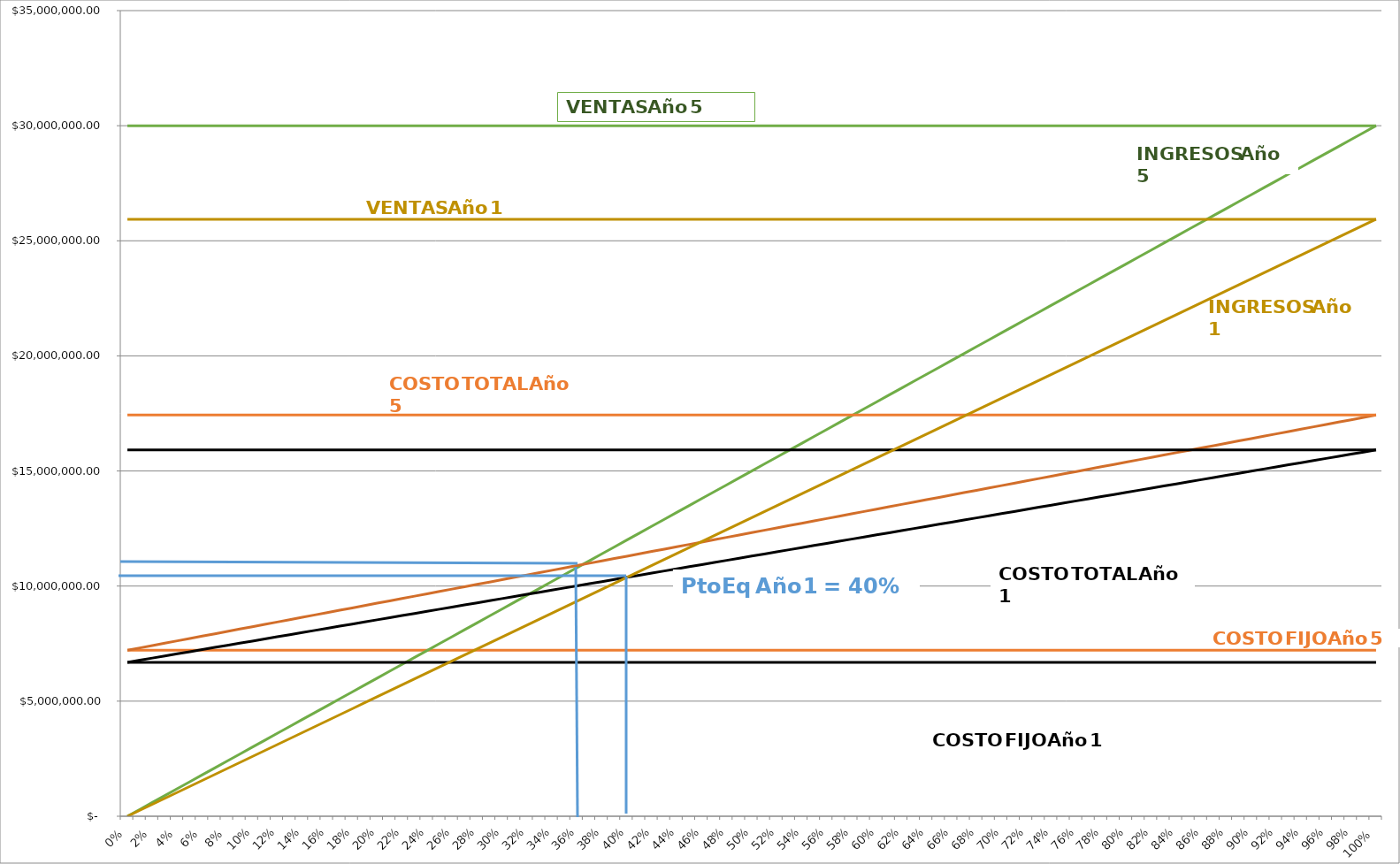
| Category | Ventas Año 5 | CFT Año 5 | Ing Año 5 | CV Año 5 | CT Año 5 | Ventas Año 1 | CFT Año 1 | CV Año 1 | CT Año 1 | Ing Año 1 |
|---|---|---|---|---|---|---|---|---|---|---|
| 0.0 | 30000000 | 7212171.791 | 0 | 7212171.791 | 17429390.383 | 25937500 | 6688326.688 | 6688326.688 | 15915076.216 | 0 |
| 0.01 | 30000000 | 7212171.791 | 300000 | 7314343.977 | 17429390.383 | 25937500 | 6688326.688 | 6780594.184 | 15915076.216 | 259375 |
| 0.02 | 30000000 | 7212171.791 | 600000 | 7416516.163 | 17429390.383 | 25937500 | 6688326.688 | 6872861.679 | 15915076.216 | 518750 |
| 0.03 | 30000000 | 7212171.791 | 900000 | 7518688.349 | 17429390.383 | 25937500 | 6688326.688 | 6965129.174 | 15915076.216 | 778125 |
| 0.04 | 30000000 | 7212171.791 | 1200000 | 7620860.535 | 17429390.383 | 25937500 | 6688326.688 | 7057396.669 | 15915076.216 | 1037500 |
| 0.05 | 30000000 | 7212171.791 | 1500000 | 7723032.721 | 17429390.383 | 25937500 | 6688326.688 | 7149664.165 | 15915076.216 | 1296875 |
| 0.06 | 30000000 | 7212171.791 | 1800000 | 7825204.907 | 17429390.383 | 25937500 | 6688326.688 | 7241931.66 | 15915076.216 | 1556250 |
| 0.07 | 30000000 | 7212171.791 | 2100000 | 7927377.093 | 17429390.383 | 25937500 | 6688326.688 | 7334199.155 | 15915076.216 | 1815625 |
| 0.08 | 30000000 | 7212171.791 | 2400000 | 8029549.279 | 17429390.383 | 25937500 | 6688326.688 | 7426466.651 | 15915076.216 | 2075000 |
| 0.09 | 30000000 | 7212171.791 | 2700000 | 8131721.465 | 17429390.383 | 25937500 | 6688326.688 | 7518734.146 | 15915076.216 | 2334375 |
| 0.1 | 30000000 | 7212171.791 | 3000000 | 8233893.651 | 17429390.383 | 25937500 | 6688326.688 | 7611001.641 | 15915076.216 | 2593750 |
| 0.11 | 30000000 | 7212171.791 | 3300000 | 8336065.836 | 17429390.383 | 25937500 | 6688326.688 | 7703269.136 | 15915076.216 | 2853125 |
| 0.12 | 30000000 | 7212171.791 | 3600000 | 8438238.022 | 17429390.383 | 25937500 | 6688326.688 | 7795536.632 | 15915076.216 | 3112500 |
| 0.13 | 30000000 | 7212171.791 | 3900000 | 8540410.208 | 17429390.383 | 25937500 | 6688326.688 | 7887804.127 | 15915076.216 | 3371875 |
| 0.14 | 30000000 | 7212171.791 | 4200000 | 8642582.394 | 17429390.383 | 25937500 | 6688326.688 | 7980071.622 | 15915076.216 | 3631250 |
| 0.15 | 30000000 | 7212171.791 | 4500000 | 8744754.58 | 17429390.383 | 25937500 | 6688326.688 | 8072339.117 | 15915076.216 | 3890625 |
| 0.16 | 30000000 | 7212171.791 | 4800000 | 8846926.766 | 17429390.383 | 25937500 | 6688326.688 | 8164606.613 | 15915076.216 | 4150000 |
| 0.17 | 30000000 | 7212171.791 | 5100000 | 8949098.952 | 17429390.383 | 25937500 | 6688326.688 | 8256874.108 | 15915076.216 | 4409375 |
| 0.18 | 30000000 | 7212171.791 | 5400000 | 9051271.138 | 17429390.383 | 25937500 | 6688326.688 | 8349141.603 | 15915076.216 | 4668750 |
| 0.19 | 30000000 | 7212171.791 | 5700000 | 9153443.324 | 17429390.383 | 25937500 | 6688326.688 | 8441409.099 | 15915076.216 | 4928125 |
| 0.2 | 30000000 | 7212171.791 | 6000000 | 9255615.51 | 17429390.383 | 25937500 | 6688326.688 | 8533676.594 | 15915076.216 | 5187500 |
| 0.21 | 30000000 | 7212171.791 | 6300000 | 9357787.696 | 17429390.383 | 25937500 | 6688326.688 | 8625944.089 | 15915076.216 | 5446875 |
| 0.22 | 30000000 | 7212171.791 | 6600000 | 9459959.882 | 17429390.383 | 25937500 | 6688326.688 | 8718211.584 | 15915076.216 | 5706250 |
| 0.23 | 30000000 | 7212171.791 | 6900000 | 9562132.068 | 17429390.383 | 25937500 | 6688326.688 | 8810479.08 | 15915076.216 | 5965625 |
| 0.24 | 30000000 | 7212171.791 | 7200000 | 9664304.253 | 17429390.383 | 25937500 | 6688326.688 | 8902746.575 | 15915076.216 | 6225000 |
| 0.25 | 30000000 | 7212171.791 | 7500000 | 9766476.439 | 17429390.383 | 25937500 | 6688326.688 | 8995014.07 | 15915076.216 | 6484375 |
| 0.26 | 30000000 | 7212171.791 | 7800000 | 9868648.625 | 17429390.383 | 25937500 | 6688326.688 | 9087281.566 | 15915076.216 | 6743750 |
| 0.27 | 30000000 | 7212171.791 | 8100000 | 9970820.811 | 17429390.383 | 25937500 | 6688326.688 | 9179549.061 | 15915076.216 | 7003125 |
| 0.28 | 30000000 | 7212171.791 | 8400000 | 10072992.997 | 17429390.383 | 25937500 | 6688326.688 | 9271816.556 | 15915076.216 | 7262500 |
| 0.29 | 30000000 | 7212171.791 | 8700000 | 10175165.183 | 17429390.383 | 25937500 | 6688326.688 | 9364084.051 | 15915076.216 | 7521875 |
| 0.3 | 30000000 | 7212171.791 | 9000000 | 10277337.369 | 17429390.383 | 25937500 | 6688326.688 | 9456351.547 | 15915076.216 | 7781250 |
| 0.31 | 30000000 | 7212171.791 | 9300000 | 10379509.555 | 17429390.383 | 25937500 | 6688326.688 | 9548619.042 | 15915076.216 | 8040625 |
| 0.32 | 30000000 | 7212171.791 | 9600000 | 10481681.741 | 17429390.383 | 25937500 | 6688326.688 | 9640886.537 | 15915076.216 | 8300000 |
| 0.33 | 30000000 | 7212171.791 | 9900000 | 10583853.927 | 17429390.383 | 25937500 | 6688326.688 | 9733154.032 | 15915076.216 | 8559375 |
| 0.34 | 30000000 | 7212171.791 | 10200000 | 10686026.113 | 17429390.383 | 25937500 | 6688326.688 | 9825421.528 | 15915076.216 | 8818750 |
| 0.35 | 30000000 | 7212171.791 | 10500000 | 10788198.299 | 17429390.383 | 25937500 | 6688326.688 | 9917689.023 | 15915076.216 | 9078125 |
| 0.36 | 30000000 | 7212171.791 | 10800000 | 10890370.484 | 17429390.383 | 25937500 | 6688326.688 | 10009956.518 | 15915076.216 | 9337500 |
| 0.37 | 30000000 | 7212171.791 | 11100000 | 10992542.67 | 17429390.383 | 25937500 | 6688326.688 | 10102224.014 | 15915076.216 | 9596875 |
| 0.38 | 30000000 | 7212171.791 | 11400000 | 11094714.856 | 17429390.383 | 25937500 | 6688326.688 | 10194491.509 | 15915076.216 | 9856250 |
| 0.39 | 30000000 | 7212171.791 | 11700000 | 11196887.042 | 17429390.383 | 25937500 | 6688326.688 | 10286759.004 | 15915076.216 | 10115625 |
| 0.4 | 30000000 | 7212171.791 | 12000000 | 11299059.228 | 17429390.383 | 25937500 | 6688326.688 | 10379026.499 | 15915076.216 | 10375000 |
| 0.41 | 30000000 | 7212171.791 | 12300000 | 11401231.414 | 17429390.383 | 25937500 | 6688326.688 | 10471293.995 | 15915076.216 | 10634375 |
| 0.42 | 30000000 | 7212171.791 | 12600000 | 11503403.6 | 17429390.383 | 25937500 | 6688326.688 | 10563561.49 | 15915076.216 | 10893750 |
| 0.43 | 30000000 | 7212171.791 | 12900000 | 11605575.786 | 17429390.383 | 25937500 | 6688326.688 | 10655828.985 | 15915076.216 | 11153125 |
| 0.44 | 30000000 | 7212171.791 | 13200000 | 11707747.972 | 17429390.383 | 25937500 | 6688326.688 | 10748096.481 | 15915076.216 | 11412500 |
| 0.45 | 30000000 | 7212171.791 | 13500000 | 11809920.158 | 17429390.383 | 25937500 | 6688326.688 | 10840363.976 | 15915076.216 | 11671875 |
| 0.46 | 30000000 | 7212171.791 | 13800000 | 11912092.344 | 17429390.383 | 25937500 | 6688326.688 | 10932631.471 | 15915076.216 | 11931250 |
| 0.47 | 30000000 | 7212171.791 | 14100000 | 12014264.53 | 17429390.383 | 25937500 | 6688326.688 | 11024898.966 | 15915076.216 | 12190625 |
| 0.48 | 30000000 | 7212171.791 | 14400000 | 12116436.716 | 17429390.383 | 25937500 | 6688326.688 | 11117166.462 | 15915076.216 | 12450000 |
| 0.49 | 30000000 | 7212171.791 | 14700000 | 12218608.901 | 17429390.383 | 25937500 | 6688326.688 | 11209433.957 | 15915076.216 | 12709375 |
| 0.5 | 30000000 | 7212171.791 | 15000000 | 12320781.087 | 17429390.383 | 25937500 | 6688326.688 | 11301701.452 | 15915076.216 | 12968750 |
| 0.51 | 30000000 | 7212171.791 | 15300000 | 12422953.273 | 17429390.383 | 25937500 | 6688326.688 | 11393968.947 | 15915076.216 | 13228125 |
| 0.52 | 30000000 | 7212171.791 | 15600000 | 12525125.459 | 17429390.383 | 25937500 | 6688326.688 | 11486236.443 | 15915076.216 | 13487500 |
| 0.53 | 30000000 | 7212171.791 | 15900000 | 12627297.645 | 17429390.383 | 25937500 | 6688326.688 | 11578503.938 | 15915076.216 | 13746875 |
| 0.54 | 30000000 | 7212171.791 | 16200000 | 12729469.831 | 17429390.383 | 25937500 | 6688326.688 | 11670771.433 | 15915076.216 | 14006250 |
| 0.55 | 30000000 | 7212171.791 | 16500000 | 12831642.017 | 17429390.383 | 25937500 | 6688326.688 | 11763038.929 | 15915076.216 | 14265625 |
| 0.56 | 30000000 | 7212171.791 | 16800000 | 12933814.203 | 17429390.383 | 25937500 | 6688326.688 | 11855306.424 | 15915076.216 | 14525000 |
| 0.57 | 30000000 | 7212171.791 | 17100000 | 13035986.389 | 17429390.383 | 25937500 | 6688326.688 | 11947573.919 | 15915076.216 | 14784375 |
| 0.58 | 30000000 | 7212171.791 | 17400000 | 13138158.575 | 17429390.383 | 25937500 | 6688326.688 | 12039841.414 | 15915076.216 | 15043750 |
| 0.59 | 30000000 | 7212171.791 | 17700000 | 13240330.761 | 17429390.383 | 25937500 | 6688326.688 | 12132108.91 | 15915076.216 | 15303125 |
| 0.6 | 30000000 | 7212171.791 | 18000000 | 13342502.947 | 17429390.383 | 25937500 | 6688326.688 | 12224376.405 | 15915076.216 | 15562500 |
| 0.61 | 30000000 | 7212171.791 | 18300000 | 13444675.132 | 17429390.383 | 25937500 | 6688326.688 | 12316643.9 | 15915076.216 | 15821875 |
| 0.62 | 30000000 | 7212171.791 | 18600000 | 13546847.318 | 17429390.383 | 25937500 | 6688326.688 | 12408911.396 | 15915076.216 | 16081250 |
| 0.63 | 30000000 | 7212171.791 | 18900000 | 13649019.504 | 17429390.383 | 25937500 | 6688326.688 | 12501178.891 | 15915076.216 | 16340625 |
| 0.64 | 30000000 | 7212171.791 | 19200000 | 13751191.69 | 17429390.383 | 25937500 | 6688326.688 | 12593446.386 | 15915076.216 | 16600000 |
| 0.65 | 30000000 | 7212171.791 | 19500000 | 13853363.876 | 17429390.383 | 25937500 | 6688326.688 | 12685713.881 | 15915076.216 | 16859375 |
| 0.66 | 30000000 | 7212171.791 | 19800000 | 13955536.062 | 17429390.383 | 25937500 | 6688326.688 | 12777981.377 | 15915076.216 | 17118750 |
| 0.67 | 30000000 | 7212171.791 | 20100000 | 14057708.248 | 17429390.383 | 25937500 | 6688326.688 | 12870248.872 | 15915076.216 | 17378125 |
| 0.68 | 30000000 | 7212171.791 | 20400000 | 14159880.434 | 17429390.383 | 25937500 | 6688326.688 | 12962516.367 | 15915076.216 | 17637500 |
| 0.69 | 30000000 | 7212171.791 | 20700000 | 14262052.62 | 17429390.383 | 25937500 | 6688326.688 | 13054783.862 | 15915076.216 | 17896875 |
| 0.7 | 30000000 | 7212171.791 | 21000000 | 14364224.806 | 17429390.383 | 25937500 | 6688326.688 | 13147051.358 | 15915076.216 | 18156250 |
| 0.71 | 30000000 | 7212171.791 | 21300000 | 14466396.992 | 17429390.383 | 25937500 | 6688326.688 | 13239318.853 | 15915076.216 | 18415625 |
| 0.72 | 30000000 | 7212171.791 | 21600000 | 14568569.178 | 17429390.383 | 25937500 | 6688326.688 | 13331586.348 | 15915076.216 | 18675000 |
| 0.73 | 30000000 | 7212171.791 | 21900000 | 14670741.364 | 17429390.383 | 25937500 | 6688326.688 | 13423853.844 | 15915076.216 | 18934375 |
| 0.74 | 30000000 | 7212171.791 | 22200000 | 14772913.549 | 17429390.383 | 25937500 | 6688326.688 | 13516121.339 | 15915076.216 | 19193750 |
| 0.75 | 30000000 | 7212171.791 | 22500000 | 14875085.735 | 17429390.383 | 25937500 | 6688326.688 | 13608388.834 | 15915076.216 | 19453125 |
| 0.76 | 30000000 | 7212171.791 | 22800000 | 14977257.921 | 17429390.383 | 25937500 | 6688326.688 | 13700656.329 | 15915076.216 | 19712500 |
| 0.77 | 30000000 | 7212171.791 | 23100000 | 15079430.107 | 17429390.383 | 25937500 | 6688326.688 | 13792923.825 | 15915076.216 | 19971875 |
| 0.78 | 30000000 | 7212171.791 | 23400000 | 15181602.293 | 17429390.383 | 25937500 | 6688326.688 | 13885191.32 | 15915076.216 | 20231250 |
| 0.79 | 30000000 | 7212171.791 | 23700000 | 15283774.479 | 17429390.383 | 25937500 | 6688326.688 | 13977458.815 | 15915076.216 | 20490625 |
| 0.8 | 30000000 | 7212171.791 | 24000000 | 15385946.665 | 17429390.383 | 25937500 | 6688326.688 | 14069726.311 | 15915076.216 | 20750000 |
| 0.81 | 30000000 | 7212171.791 | 24300000 | 15488118.851 | 17429390.383 | 25937500 | 6688326.688 | 14161993.806 | 15915076.216 | 21009375 |
| 0.82 | 30000000 | 7212171.791 | 24600000 | 15590291.037 | 17429390.383 | 25937500 | 6688326.688 | 14254261.301 | 15915076.216 | 21268750 |
| 0.83 | 30000000 | 7212171.791 | 24900000 | 15692463.223 | 17429390.383 | 25937500 | 6688326.688 | 14346528.796 | 15915076.216 | 21528125 |
| 0.84 | 30000000 | 7212171.791 | 25200000 | 15794635.409 | 17429390.383 | 25937500 | 6688326.688 | 14438796.292 | 15915076.216 | 21787500 |
| 0.85 | 30000000 | 7212171.791 | 25500000 | 15896807.595 | 17429390.383 | 25937500 | 6688326.688 | 14531063.787 | 15915076.216 | 22046875 |
| 0.86 | 30000000 | 7212171.791 | 25800000 | 15998979.78 | 17429390.383 | 25937500 | 6688326.688 | 14623331.282 | 15915076.216 | 22306250 |
| 0.87 | 30000000 | 7212171.791 | 26100000 | 16101151.966 | 17429390.383 | 25937500 | 6688326.688 | 14715598.777 | 15915076.216 | 22565625 |
| 0.88 | 30000000 | 7212171.791 | 26400000 | 16203324.152 | 17429390.383 | 25937500 | 6688326.688 | 14807866.273 | 15915076.216 | 22825000 |
| 0.89 | 30000000 | 7212171.791 | 26700000 | 16305496.338 | 17429390.383 | 25937500 | 6688326.688 | 14900133.768 | 15915076.216 | 23084375 |
| 0.9 | 30000000 | 7212171.791 | 27000000 | 16407668.524 | 17429390.383 | 25937500 | 6688326.688 | 14992401.263 | 15915076.216 | 23343750 |
| 0.91 | 30000000 | 7212171.791 | 27300000 | 16509840.71 | 17429390.383 | 25937500 | 6688326.688 | 15084668.759 | 15915076.216 | 23603125 |
| 0.92 | 30000000 | 7212171.791 | 27600000 | 16612012.896 | 17429390.383 | 25937500 | 6688326.688 | 15176936.254 | 15915076.216 | 23862500 |
| 0.93 | 30000000 | 7212171.791 | 27900000 | 16714185.082 | 17429390.383 | 25937500 | 6688326.688 | 15269203.749 | 15915076.216 | 24121875 |
| 0.94 | 30000000 | 7212171.791 | 28200000 | 16816357.268 | 17429390.383 | 25937500 | 6688326.688 | 15361471.244 | 15915076.216 | 24381250 |
| 0.95 | 30000000 | 7212171.791 | 28500000 | 16918529.454 | 17429390.383 | 25937500 | 6688326.688 | 15453738.74 | 15915076.216 | 24640625 |
| 0.96 | 30000000 | 7212171.791 | 28800000 | 17020701.64 | 17429390.383 | 25937500 | 6688326.688 | 15546006.235 | 15915076.216 | 24900000 |
| 0.97 | 30000000 | 7212171.791 | 29100000 | 17122873.826 | 17429390.383 | 25937500 | 6688326.688 | 15638273.73 | 15915076.216 | 25159375 |
| 0.98 | 30000000 | 7212171.791 | 29400000 | 17225046.012 | 17429390.383 | 25937500 | 6688326.688 | 15730541.225 | 15915076.216 | 25418750 |
| 0.99 | 30000000 | 7212171.791 | 29700000 | 17327218.197 | 17429390.383 | 25937500 | 6688326.688 | 15822808.721 | 15915076.216 | 25678125 |
| 1.0 | 30000000 | 7212171.791 | 30000000 | 17429390.383 | 17429390.383 | 25937500 | 6688326.688 | 15915076.216 | 15915076.216 | 25937500 |